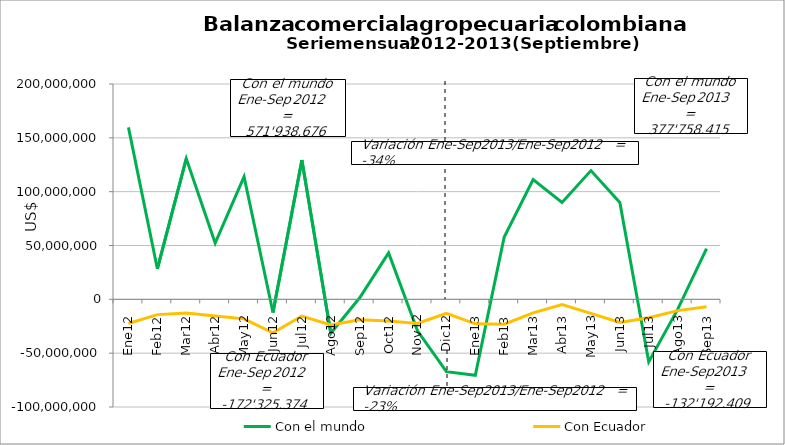
| Category | Con el mundo | Con Ecuador |
|---|---|---|
| 0 | 159718811.51 | -22456472.96 |
| 1 | 28364992.2 | -14201495.08 |
| 2 | 130703935.59 | -12693324.74 |
| 3 | 52247887.52 | -15524732.79 |
| 4 | 113869665.14 | -18155171.7 |
| 5 | -12237508.2 | -31088924.89 |
| 6 | 129307489.88 | -15534038.07 |
| 7 | -31469488.76 | -23790294.63 |
| 8 | 1432890.8 | -18880918.76 |
| 9 | 43089965.32 | -20100739.52 |
| 10 | -29233849.86 | -22394035.04 |
| 11 | -67196809.33 | -13109706.44 |
| 12 | -70591672.64 | -22718267.79 |
| 13 | 57888002.76 | -23104890.08 |
| 14 | 111239208.87 | -12567304.55 |
| 15 | 90043885.64 | -4817774.24 |
| 16 | 119554876.57 | -13044186.92 |
| 17 | 89894947.57 | -21461941.81 |
| 18 | -58064700.6 | -17077507.7 |
| 19 | -9356684.56 | -10469403.81 |
| 20 | 47150551.01 | -6931131.99 |